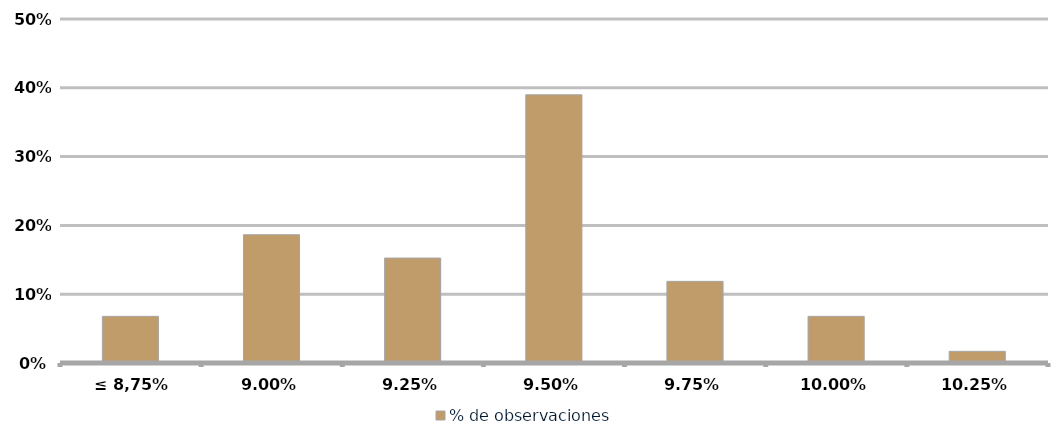
| Category | % de observaciones  |
|---|---|
| ≤ 8,75% | 0.068 |
| 9,00% | 0.186 |
| 9,25% | 0.153 |
| 9,50% | 0.39 |
| 9,75% | 0.119 |
| 10,00% | 0.068 |
| 10,25% | 0.017 |